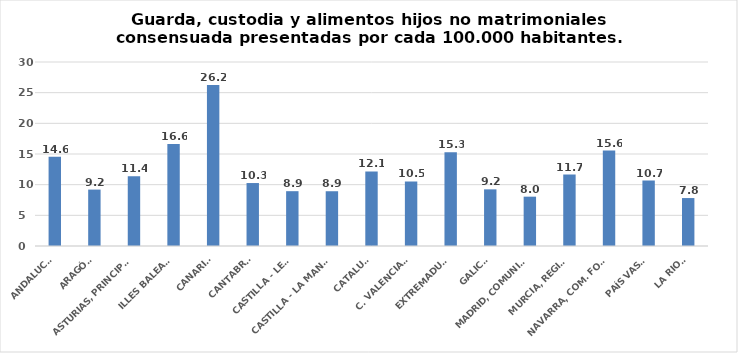
| Category | Series 0 |
|---|---|
| ANDALUCÍA | 14.557 |
| ARAGÓN | 9.199 |
| ASTURIAS, PRINCIPADO | 11.366 |
| ILLES BALEARS | 16.624 |
| CANARIAS | 26.232 |
| CANTABRIA | 10.265 |
| CASTILLA - LEÓN | 8.938 |
| CASTILLA - LA MANCHA | 8.929 |
| CATALUÑA | 12.147 |
| C. VALENCIANA | 10.518 |
| EXTREMADURA | 15.29 |
| GALICIA | 9.237 |
| MADRID, COMUNIDAD | 8.043 |
| MURCIA, REGIÓN | 11.656 |
| NAVARRA, COM. FORAL | 15.57 |
| PAÍS VASCO | 10.659 |
| LA RIOJA | 7.817 |